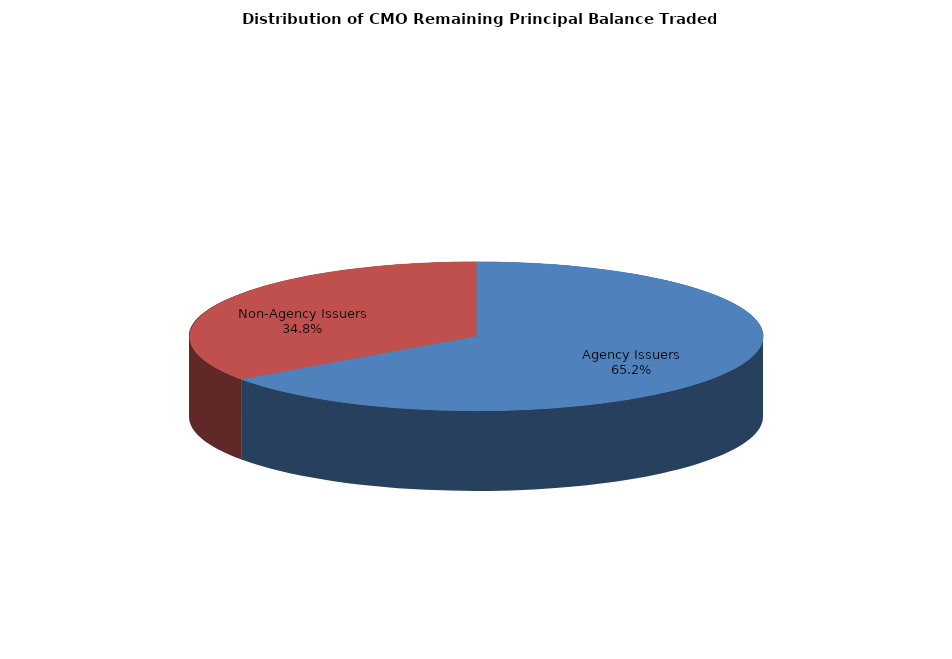
| Category | Series 0 |
|---|---|
| Agency Issuers | 6185258477.5 |
| Non-Agency Issuers | 3299879297.562 |